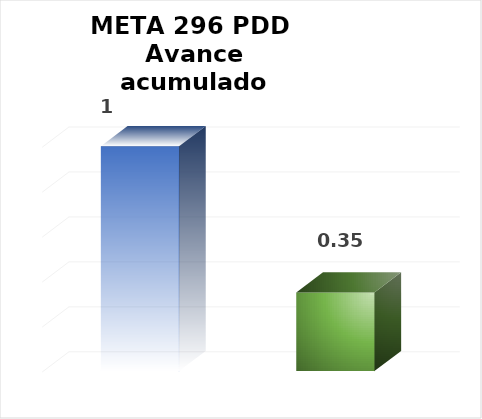
| Category | Meta PDD 2024 |
|---|---|
| 0 | 1 |
| 1 | 0.35 |